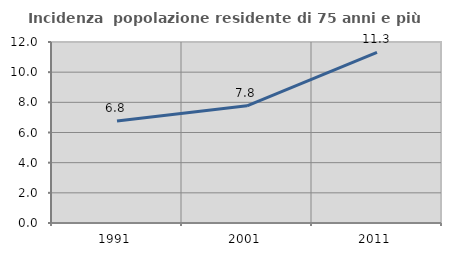
| Category | Incidenza  popolazione residente di 75 anni e più |
|---|---|
| 1991.0 | 6.764 |
| 2001.0 | 7.768 |
| 2011.0 | 11.317 |